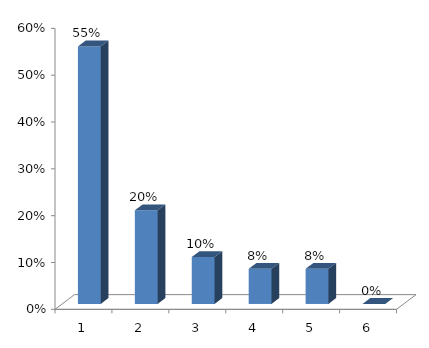
| Category | Series 0 |
|---|---|
| 0 | 0.55 |
| 1 | 0.2 |
| 2 | 0.1 |
| 3 | 0.075 |
| 4 | 0.075 |
| 5 | 0 |